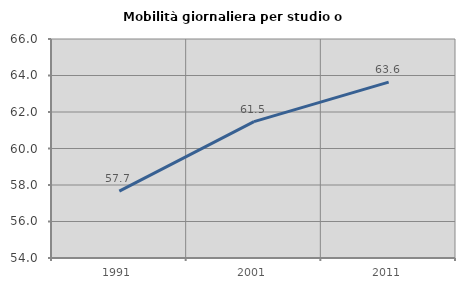
| Category | Mobilità giornaliera per studio o lavoro |
|---|---|
| 1991.0 | 57.662 |
| 2001.0 | 61.471 |
| 2011.0 | 63.636 |